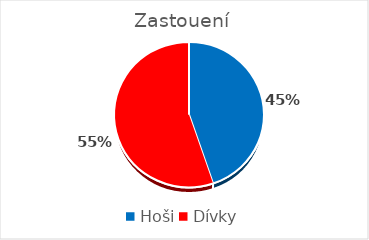
| Category | Series 0 |
|---|---|
| Hoši | 69 |
| Dívky | 85 |